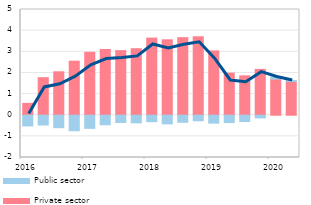
| Category | Private sector  | Public sector |
|---|---|---|
| 2016 | 0.559 | -0.507 |
| II | 1.776 | -0.463 |
| III | 2.053 | -0.589 |
| IV | 2.556 | -0.733 |
| 2017 | 2.977 | -0.621 |
| II | 3.109 | -0.452 |
| III | 3.055 | -0.347 |
| IV | 3.145 | -0.363 |
| 2018 | 3.649 | -0.305 |
| II | 3.567 | -0.411 |
| III | 3.668 | -0.334 |
| IV | 3.71 | -0.263 |
| 2019 | 3.039 | -0.375 |
| II | 1.992 | -0.349 |
| III | 1.862 | -0.298 |
| IV | 2.168 | -0.13 |
| 2020 | 1.708 | 0.102 |
| II | 1.599 | 0.045 |